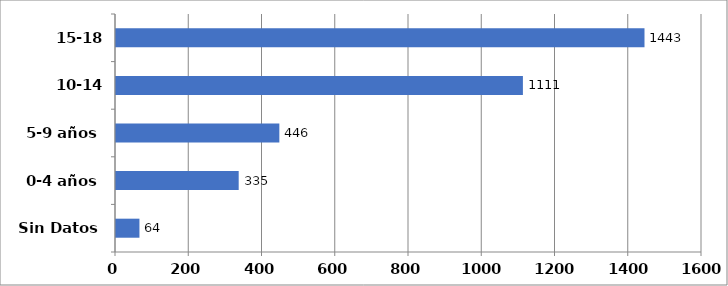
| Category | Series 0 |
|---|---|
| Sin Datos | 64 |
| 0-4 años | 335 |
| 5-9 años | 446 |
| 10-14 años | 1111 |
| 15-18 años | 1443 |